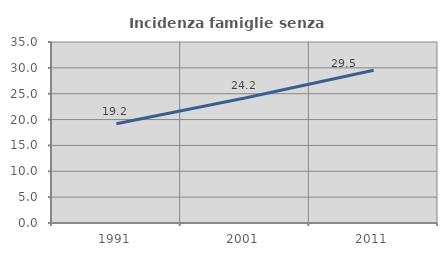
| Category | Incidenza famiglie senza nuclei |
|---|---|
| 1991.0 | 19.185 |
| 2001.0 | 24.165 |
| 2011.0 | 29.539 |